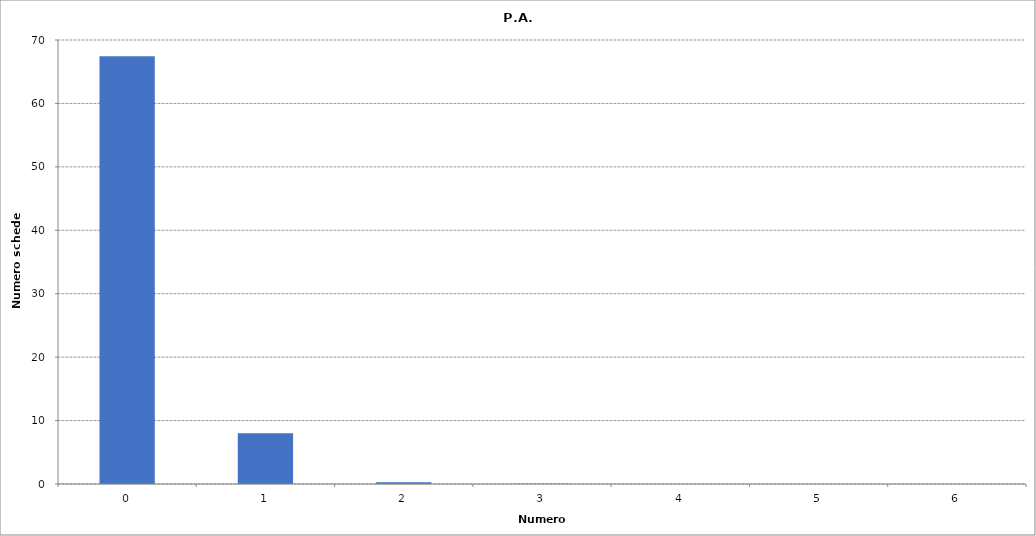
| Category | Series 0 |
|---|---|
| 0.0 | 67454 |
| 1.0 | 7987 |
| 2.0 | 266 |
| 3.0 | 31 |
| 4.0 | 9 |
| 5.0 | 2 |
| 6.0 | 2 |